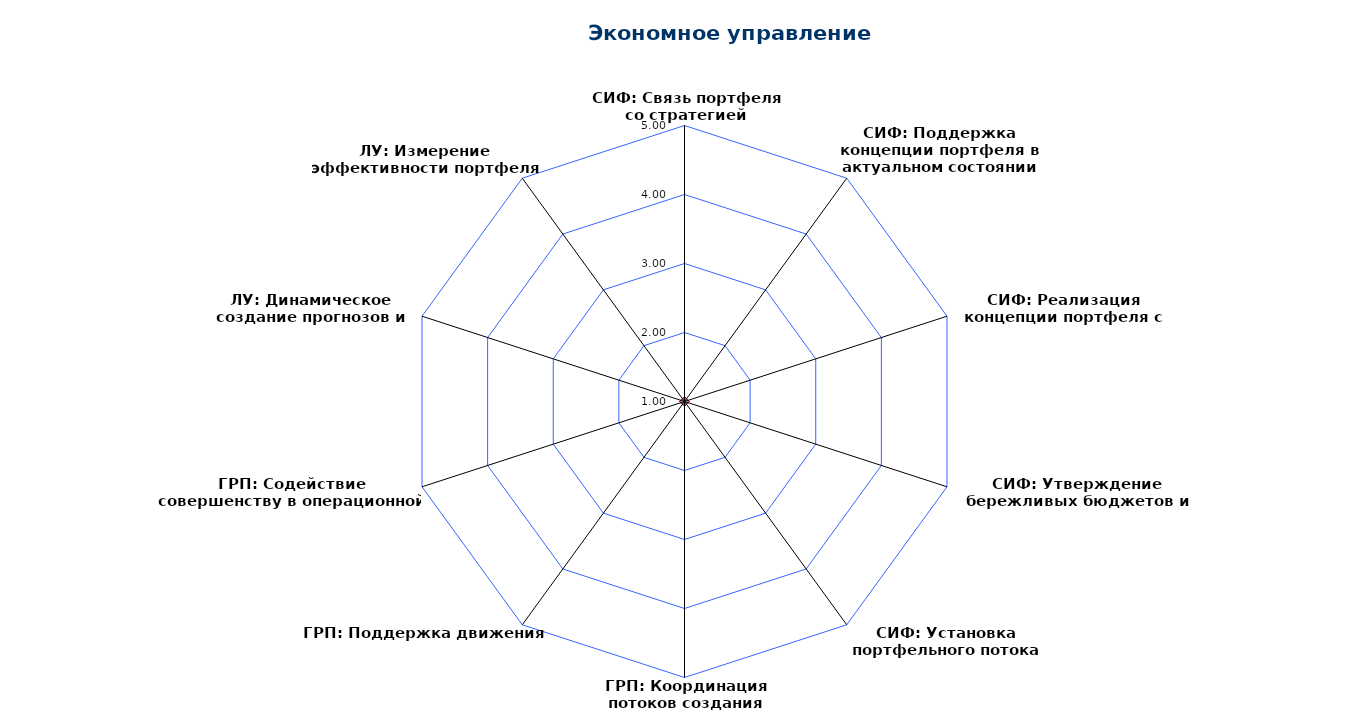
| Category | Series 0 |
|---|---|
| СИФ: Связь портфеля со стратегией предприятия | 1 |
| СИФ: Поддержка концепции портфеля в актуальном состоянии | 1 |
| СИФ: Реализация концепции портфеля с помощью эпиков | 1 |
| СИФ: Утверждение бережливых бюджетов и ограничений | 1 |
| СИФ: Установка портфельного потока | 1 |
| ГРП: Координация потоков создания ценности | 1 |
| ГРП: Поддержка движения ART | 1 |
| ГРП: Содействие совершенству в операционной деятельности | 1 |
| ЛУ: Динамическое создание прогнозов и бюджетов | 1 |
| ЛУ: Измерение эффективности портфеля | 1 |